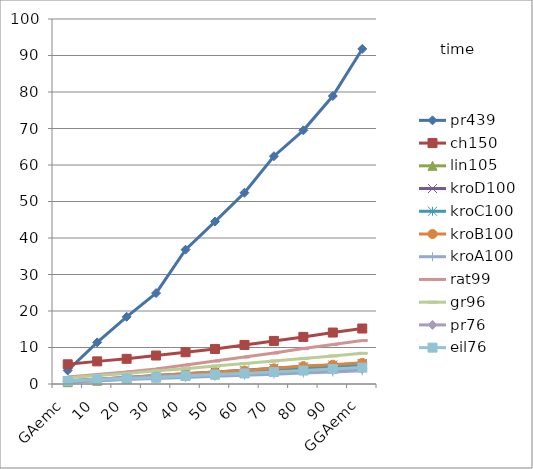
| Category | pr439 | ch150 | lin105 | kroD100 | kroC100 | kroB100 | kroA100 | rat99 | gr96 | pr76 | eil76 |
|---|---|---|---|---|---|---|---|---|---|---|---|
| 0 | 3.7 | 5.4 | 0.5 | 0.8 | 0.7 | 0.8 | 0.6 | 1.9 | 1.7 | 0.9 | 0.8 |
| 1 | 11.4 | 6.2 | 0.9 | 1.3 | 1.2 | 1.3 | 0.9 | 2.6 | 2.3 | 1.3 | 1.2 |
| 2 | 18.4 | 6.9 | 1.4 | 1.8 | 1.6 | 1.8 | 1.2 | 3.3 | 2.9 | 1.7 | 1.5 |
| 3 | 24.9 | 7.8 | 1.8 | 2.3 | 2.1 | 2.3 | 1.5 | 4.1 | 3.6 | 2.1 | 1.8 |
| 4 | 36.8 | 8.7 | 2.2 | 2.8 | 2.5 | 2.8 | 1.8 | 5.2 | 4.2 | 2.4 | 2.2 |
| 5 | 44.5 | 9.6 | 2.6 | 3.3 | 2.9 | 3.3 | 2.1 | 6.3 | 4.9 | 2.7 | 2.6 |
| 6 | 52.4 | 10.7 | 3 | 3.8 | 3.3 | 3.7 | 2.4 | 7.4 | 5.6 | 2.9 | 2.9 |
| 7 | 62.4 | 11.8 | 3.4 | 4.3 | 3.7 | 4.3 | 2.7 | 8.5 | 6.3 | 3.2 | 3.3 |
| 8 | 69.5 | 12.9 | 3.8 | 4.7 | 4.3 | 4.9 | 3 | 9.7 | 7 | 3.5 | 3.7 |
| 9 | 78.9 | 14.1 | 4.2 | 5.2 | 4.8 | 5.3 | 3.3 | 10.8 | 7.7 | 3.8 | 4.1 |
| 10 | 91.8 | 15.2 | 4.6 | 5.6 | 5.3 | 5.8 | 3.6 | 11.9 | 8.4 | 4.1 | 4.5 |